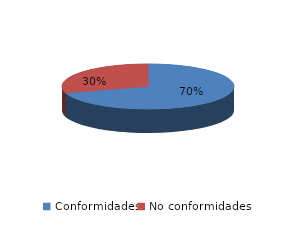
| Category | Series 0 |
|---|---|
| Conformidades | 826 |
| No conformidades | 351 |